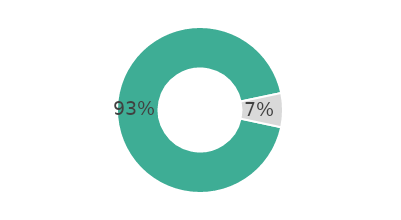
| Category | Series 0 |
|---|---|
| 0 | 93.381 |
| 1 | 6.619 |